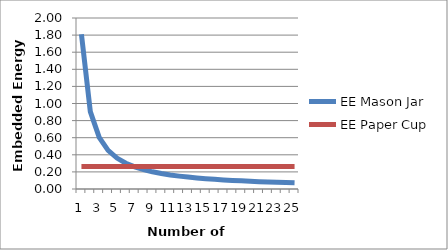
| Category | EE Mason Jar | EE Paper Cup |
|---|---|---|
| 0 | 1.81 | 0.262 |
| 1 | 0.905 | 0.262 |
| 2 | 0.603 | 0.262 |
| 3 | 0.452 | 0.262 |
| 4 | 0.362 | 0.262 |
| 5 | 0.302 | 0.262 |
| 6 | 0.259 | 0.262 |
| 7 | 0.226 | 0.262 |
| 8 | 0.201 | 0.262 |
| 9 | 0.181 | 0.262 |
| 10 | 0.165 | 0.262 |
| 11 | 0.151 | 0.262 |
| 12 | 0.139 | 0.262 |
| 13 | 0.129 | 0.262 |
| 14 | 0.121 | 0.262 |
| 15 | 0.113 | 0.262 |
| 16 | 0.106 | 0.262 |
| 17 | 0.101 | 0.262 |
| 18 | 0.095 | 0.262 |
| 19 | 0.09 | 0.262 |
| 20 | 0.086 | 0.262 |
| 21 | 0.082 | 0.262 |
| 22 | 0.079 | 0.262 |
| 23 | 0.075 | 0.262 |
| 24 | 0.072 | 0.262 |